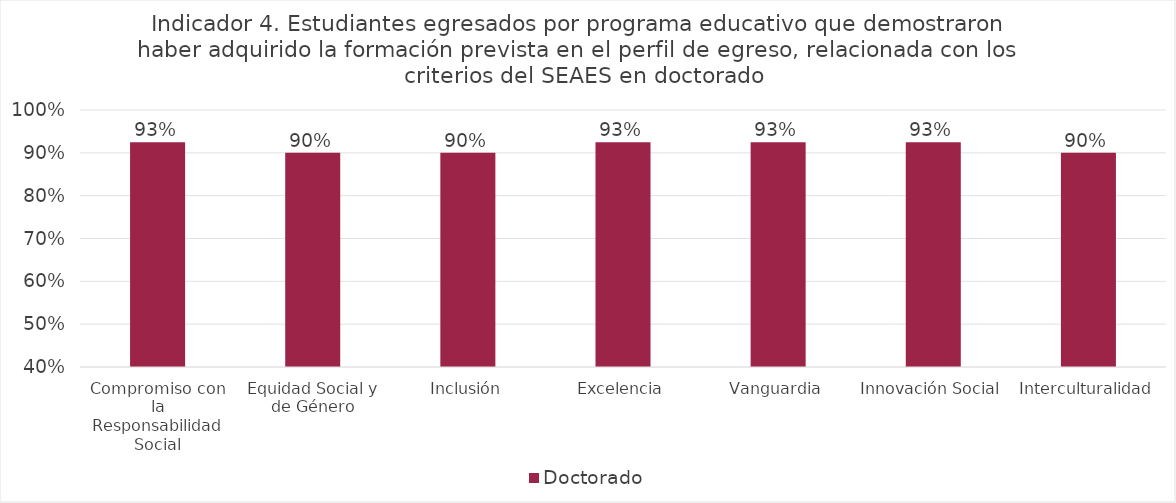
| Category | Doctorado |
|---|---|
| Compromiso con la Responsabilidad Social | 0.925 |
| Equidad Social y de Género | 0.9 |
| Inclusión | 0.9 |
| Excelencia | 0.925 |
| Vanguardia | 0.925 |
| Innovación Social | 0.925 |
| Interculturalidad | 0.9 |